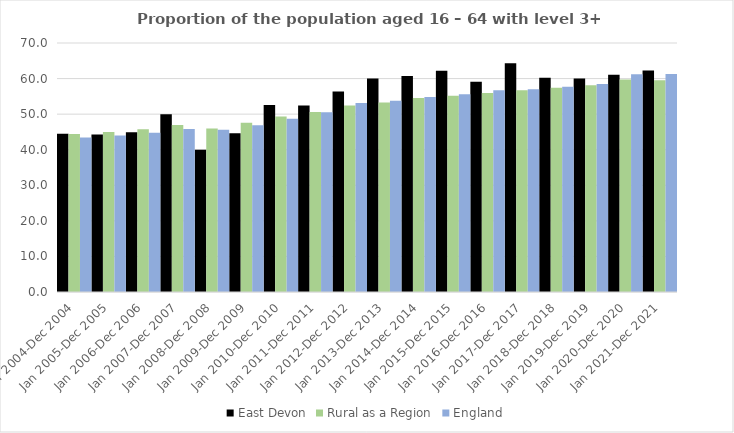
| Category | East Devon | Rural as a Region | England |
|---|---|---|---|
| Jan 2004-Dec 2004 | 44.5 | 44.405 | 43.4 |
| Jan 2005-Dec 2005 | 44.3 | 44.973 | 44 |
| Jan 2006-Dec 2006 | 44.9 | 45.774 | 44.8 |
| Jan 2007-Dec 2007 | 50 | 46.968 | 45.8 |
| Jan 2008-Dec 2008 | 40 | 45.964 | 45.6 |
| Jan 2009-Dec 2009 | 44.6 | 47.59 | 46.9 |
| Jan 2010-Dec 2010 | 52.6 | 49.362 | 48.7 |
| Jan 2011-Dec 2011 | 52.4 | 50.602 | 50.5 |
| Jan 2012-Dec 2012 | 56.4 | 52.439 | 53.1 |
| Jan 2013-Dec 2013 | 60 | 53.276 | 53.8 |
| Jan 2014-Dec 2014 | 60.7 | 54.57 | 54.8 |
| Jan 2015-Dec 2015 | 62.2 | 55.16 | 55.6 |
| Jan 2016-Dec 2016 | 59.1 | 55.941 | 56.7 |
| Jan 2017-Dec 2017 | 64.3 | 56.689 | 57 |
| Jan 2018-Dec 2018 | 60.2 | 57.389 | 57.7 |
| Jan 2019-Dec 2019 | 60 | 58.147 | 58.5 |
| Jan 2020-Dec 2020 | 61.1 | 59.771 | 61.2 |
| Jan 2021-Dec 2021 | 62.3 | 59.54 | 61.3 |